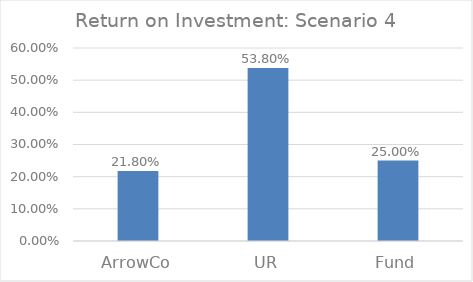
| Category | Series 0 |
|---|---|
| ArrowCo | 0.218 |
| UR | 0.538 |
| Fund | 0.25 |